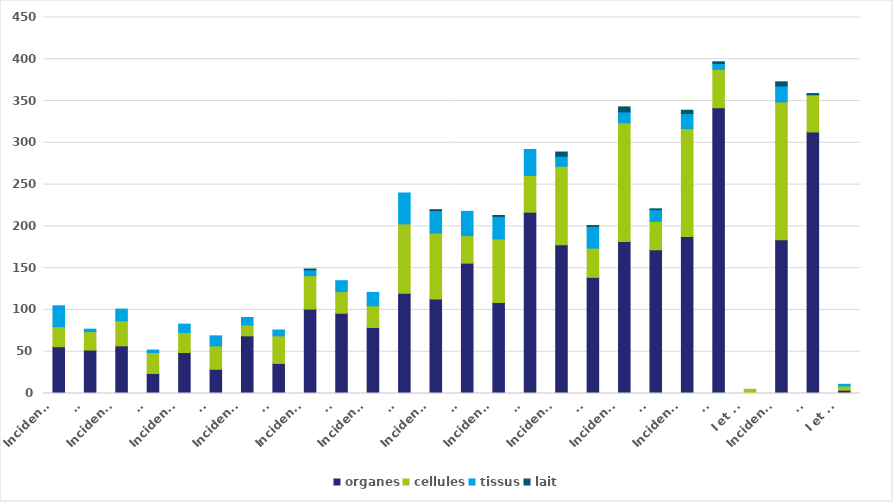
| Category | organes | cellules | tissus | lait |
|---|---|---|---|---|
| 0 | 56 | 24 | 25 | 0 |
| 1 | 52 | 22 | 3 | 0 |
| 2 | 57 | 30 | 14 | 0 |
| 3 | 24 | 25 | 3 | 0 |
| 4 | 49 | 24 | 10 | 0 |
| 5 | 29 | 28 | 12 | 0 |
| 6 | 69 | 13 | 9 | 0 |
| 7 | 36 | 33 | 7 | 0 |
| 8 | 101 | 40 | 7 | 1 |
| 9 | 96 | 26 | 13 | 0 |
| 10 | 79 | 26 | 16 | 0 |
| 11 | 120 | 83 | 37 | 0 |
| 12 | 113 | 79 | 27 | 1 |
| 13 | 156 | 33 | 29 | 0 |
| 14 | 109 | 76 | 27 | 1 |
| 15 | 217 | 44 | 31 | 0 |
| 16 | 178 | 94 | 12 | 5 |
| 17 | 139 | 35 | 26 | 1 |
| 18 | 182 | 142 | 13 | 6 |
| 19 | 172 | 34 | 14 | 1 |
| 20 | 188 | 129 | 18 | 4 |
| 21 | 342 | 46 | 7 | 2 |
| 22 | 0 | 5 | 0 | 0 |
| 23 | 184 | 165 | 19 | 5 |
| 24 | 313 | 44 | 1 | 1 |
| 25 | 4 | 5 | 2 | 0 |